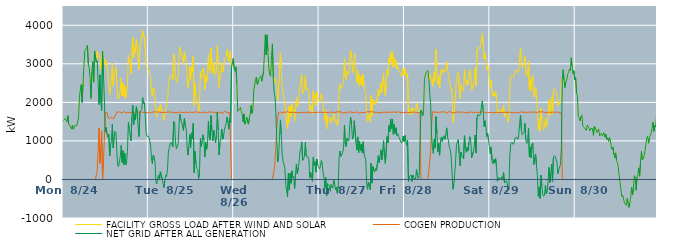
| Category | FACILITY GROSS LOAD AFTER WIND AND SOLAR | COGEN PRODUCTION | NET GRID AFTER ALL GENERATION |
|---|---|---|---|
|  Mon  8/24 | 1529 | 0 | 1529 |
|  Mon  8/24 | 1554 | 0 | 1554 |
|  Mon  8/24 | 1584 | 0 | 1584 |
|  Mon  8/24 | 1543 | 0 | 1543 |
|  Mon  8/24 | 1489 | 0 | 1489 |
|  Mon  8/24 | 1659 | 0 | 1659 |
|  Mon  8/24 | 1444 | 0 | 1444 |
|  Mon  8/24 | 1433 | 0 | 1433 |
|  Mon  8/24 | 1363 | 0 | 1363 |
|  Mon  8/24 | 1308 | 0 | 1308 |
|  Mon  8/24 | 1404 | 0 | 1404 |
|  Mon  8/24 | 1299 | 0 | 1299 |
|  Mon  8/24 | 1345 | 0 | 1345 |
|  Mon  8/24 | 1401 | 0 | 1401 |
|  Mon  8/24 | 1379 | 0 | 1379 |
|  Mon  8/24 | 1394 | 0 | 1394 |
|  Mon  8/24 | 1381 | 0 | 1381 |
|  Mon  8/24 | 1596 | 0 | 1596 |
|  Mon  8/24 | 2138 | 0 | 2138 |
|  Mon  8/24 | 2319 | 0 | 2319 |
|  Mon  8/24 | 2463 | 0 | 2463 |
|  Mon  8/24 | 1998 | 0 | 1998 |
|  Mon  8/24 | 2466 | 0 | 2466 |
|  Mon  8/24 | 2927 | 0 | 2927 |
|  Mon  8/24 | 3332 | 0 | 3332 |
|  Mon  8/24 | 3370 | 0 | 3370 |
|  Mon  8/24 | 3423 | 0 | 3423 |
|  Mon  8/24 | 3482 | 0 | 3482 |
|  Mon  8/24 | 2977 | 0 | 2977 |
|  Mon  8/24 | 2883 | 0 | 2883 |
|  Mon  8/24 | 2602 | 0 | 2602 |
|  Mon  8/24 | 2101 | 0 | 2101 |
|  Mon  8/24 | 2785 | 0 | 2785 |
|  Mon  8/24 | 3054 | 0 | 3054 |
|  Mon  8/24 | 2524 | 0 | 2524 |
|  Mon  8/24 | 3336 | 0 | 3336 |
|  Mon  8/24 | 3355 | 0 | 3355 |
|  Mon  8/24 | 3036 | 0 | 3036 |
|  Mon  8/24 | 3329 | 250 | 3079 |
|  Mon  8/24 | 3273 | 745 | 2528 |
|  Mon  8/24 | 3279 | 1335 | 1944 |
|  Mon  8/24 | 3135 | 419 | 2716 |
|  Mon  8/24 | 2861 | 839 | 2022 |
|  Mon  8/24 | 3051 | 1260 | 1791 |
|  Mon  8/24 | 3333 | 0 | 3333 |
|  Mon  8/24 | 3189 | 492 | 2697 |
|  Mon  8/24 | 3135 | 1018 | 2117 |
|  Mon  8/24 | 2981 | 1740 | 1241 |
|  Mon  8/24 | 3085 | 1733 | 1352 |
|  Mon  8/24 | 2917 | 1737 | 1180 |
|  Mon  8/24 | 2735 | 1641 | 1094 |
|  Mon  8/24 | 2754 | 1580 | 1174 |
|  Mon  8/24 | 2206 | 1595 | 611 |
|  Mon  8/24 | 2457 | 1606 | 851 |
|  Mon  8/24 | 2640 | 1593 | 1047 |
|  Mon  8/24 | 3020 | 1589 | 1431 |
|  Mon  8/24 | 2426 | 1609 | 817 |
|  Mon  8/24 | 2697 | 1593 | 1104 |
|  Mon  8/24 | 2839 | 1588 | 1251 |
|  Mon  8/24 | 2912 | 1688 | 1224 |
|  Mon  8/24 | 2494 | 1746 | 748 |
|  Mon  8/24 | 2114 | 1750 | 364 |
|  Mon  8/24 | 2082 | 1752 | 330 |
|  Mon  8/24 | 2210 | 1750 | 460 |
|  Mon  8/24 | 2361 | 1749 | 612 |
|  Mon  8/24 | 2626 | 1741 | 885 |
|  Mon  8/24 | 2170 | 1729 | 441 |
|  Mon  8/24 | 2493 | 1746 | 747 |
|  Mon  8/24 | 2148 | 1764 | 384 |
|  Mon  8/24 | 2430 | 1751 | 679 |
|  Mon  8/24 | 2108 | 1728 | 380 |
|  Mon  8/24 | 2209 | 1753 | 456 |
|  Mon  8/24 | 2459 | 1729 | 730 |
|  Mon  8/24 | 3231 | 1746 | 1485 |
|  Mon  8/24 | 3044 | 1742 | 1302 |
|  Mon  8/24 | 3078 | 1752 | 1326 |
|  Mon  8/24 | 2735 | 1732 | 1003 |
|  Mon  8/24 | 3339 | 1723 | 1616 |
|  Mon  8/24 | 3689 | 1764 | 1925 |
|  Mon  8/24 | 3151 | 1725 | 1426 |
|  Mon  8/24 | 3428 | 1740 | 1688 |
|  Mon  8/24 | 3286 | 1738 | 1548 |
|  Mon  8/24 | 3625 | 1735 | 1890 |
|  Mon  8/24 | 3506 | 1752 | 1754 |
|  Mon  8/24 | 3101 | 1738 | 1363 |
|  Mon  8/24 | 2858 | 1745 | 1113 |
|  Mon  8/24 | 3479 | 1731 | 1748 |
|  Mon  8/24 | 3540 | 1759 | 1781 |
|  Mon  8/24 | 3556 | 1740 | 1816 |
|  Mon  8/24 | 3867 | 1742 | 2125 |
|  Mon  8/24 | 3685 | 1721 | 1964 |
|  Mon  8/24 | 3741 | 1740 | 2001 |
|  Mon  8/24 | 3382 | 1744 | 1638 |
|  Mon  8/24 | 2960 | 1736 | 1224 |
|  Mon  8/24 | 2868 | 1748 | 1120 |
|  Mon  8/24 | 2867 | 1731 | 1136 |
|  Tue  8/25 | 2855 | 1749 | 1106 |
|  Tue  8/25 | 2747 | 1744 | 1003 |
|  Tue  8/25 | 2625 | 1735 | 890 |
|  Tue  8/25 | 2280 | 1736 | 544 |
|  Tue  8/25 | 2152 | 1744 | 408 |
|  Tue  8/25 | 2379 | 1748 | 631 |
|  Tue  8/25 | 2347 | 1748 | 599 |
|  Tue  8/25 | 2218 | 1760 | 458 |
|  Tue  8/25 | 1668 | 1751 | -83 |
|  Tue  8/25 | 1620 | 1738 | -118 |
|  Tue  8/25 | 1778 | 1745 | 33 |
|  Tue  8/25 | 1874 | 1764 | 110 |
|  Tue  8/25 | 1729 | 1734 | -5 |
|  Tue  8/25 | 1951 | 1752 | 199 |
|  Tue  8/25 | 1926 | 1742 | 184 |
|  Tue  8/25 | 1763 | 1745 | 18 |
|  Tue  8/25 | 1742 | 1736 | 6 |
|  Tue  8/25 | 1529 | 1745 | -216 |
|  Tue  8/25 | 1703 | 1744 | -41 |
|  Tue  8/25 | 1840 | 1727 | 113 |
|  Tue  8/25 | 1825 | 1744 | 81 |
|  Tue  8/25 | 1999 | 1744 | 255 |
|  Tue  8/25 | 2443 | 1747 | 696 |
|  Tue  8/25 | 2570 | 1746 | 824 |
|  Tue  8/25 | 2686 | 1752 | 934 |
|  Tue  8/25 | 2693 | 1733 | 960 |
|  Tue  8/25 | 2684 | 1740 | 944 |
|  Tue  8/25 | 2587 | 1738 | 849 |
|  Tue  8/25 | 3242 | 1740 | 1502 |
|  Tue  8/25 | 3194 | 1733 | 1461 |
|  Tue  8/25 | 2704 | 1732 | 972 |
|  Tue  8/25 | 2515 | 1721 | 794 |
|  Tue  8/25 | 2565 | 1727 | 838 |
|  Tue  8/25 | 2672 | 1740 | 932 |
|  Tue  8/25 | 3148 | 1740 | 1408 |
|  Tue  8/25 | 3437 | 1750 | 1687 |
|  Tue  8/25 | 3295 | 1747 | 1548 |
|  Tue  8/25 | 3202 | 1735 | 1467 |
|  Tue  8/25 | 3224 | 1739 | 1485 |
|  Tue  8/25 | 3012 | 1742 | 1270 |
|  Tue  8/25 | 3317 | 1735 | 1582 |
|  Tue  8/25 | 3149 | 1738 | 1411 |
|  Tue  8/25 | 3074 | 1748 | 1326 |
|  Tue  8/25 | 2620 | 1751 | 869 |
|  Tue  8/25 | 2366 | 1734 | 632 |
|  Tue  8/25 | 2586 | 1748 | 838 |
|  Tue  8/25 | 2922 | 1754 | 1168 |
|  Tue  8/25 | 2573 | 1747 | 826 |
|  Tue  8/25 | 2944 | 1734 | 1210 |
|  Tue  8/25 | 2795 | 1742 | 1053 |
|  Tue  8/25 | 3194 | 1738 | 1456 |
|  Tue  8/25 | 1923 | 1747 | 176 |
|  Tue  8/25 | 2487 | 1756 | 731 |
|  Tue  8/25 | 2154 | 1747 | 407 |
|  Tue  8/25 | 2031 | 1745 | 286 |
|  Tue  8/25 | 1980 | 1723 | 257 |
|  Tue  8/25 | 1769 | 1744 | 25 |
|  Tue  8/25 | 1896 | 1748 | 148 |
|  Tue  8/25 | 2802 | 1735 | 1067 |
|  Tue  8/25 | 2610 | 1753 | 857 |
|  Tue  8/25 | 2745 | 1743 | 1002 |
|  Tue  8/25 | 2888 | 1728 | 1160 |
|  Tue  8/25 | 2767 | 1749 | 1018 |
|  Tue  8/25 | 2325 | 1743 | 582 |
|  Tue  8/25 | 2694 | 1727 | 967 |
|  Tue  8/25 | 2527 | 1747 | 780 |
|  Tue  8/25 | 2668 | 1738 | 930 |
|  Tue  8/25 | 3258 | 1750 | 1508 |
|  Tue  8/25 | 2854 | 1750 | 1104 |
|  Tue  8/25 | 2767 | 1750 | 1017 |
|  Tue  8/25 | 3405 | 1748 | 1657 |
|  Tue  8/25 | 2970 | 1733 | 1237 |
|  Tue  8/25 | 2743 | 1742 | 1001 |
|  Tue  8/25 | 3034 | 1757 | 1277 |
|  Tue  8/25 | 2888 | 1742 | 1146 |
|  Tue  8/25 | 2701 | 1756 | 945 |
|  Tue  8/25 | 2863 | 1725 | 1138 |
|  Tue  8/25 | 3482 | 1746 | 1736 |
|  Tue  8/25 | 3030 | 1744 | 1286 |
|  Tue  8/25 | 2393 | 1759 | 634 |
|  Tue  8/25 | 2694 | 1746 | 948 |
|  Tue  8/25 | 2803 | 1741 | 1062 |
|  Tue  8/25 | 3031 | 1723 | 1308 |
|  Tue  8/25 | 2783 | 1741 | 1042 |
|  Tue  8/25 | 2851 | 1732 | 1119 |
|  Tue  8/25 | 3047 | 1767 | 1280 |
|  Tue  8/25 | 3132 | 1754 | 1378 |
|  Tue  8/25 | 3203 | 1752 | 1451 |
|  Tue  8/25 | 3374 | 1752 | 1622 |
|  Tue  8/25 | 3208 | 1732 | 1476 |
|  Tue  8/25 | 3054 | 1750 | 1304 |
|  Tue  8/25 | 3324 | 1740 | 1584 |
|  Tue  8/25 | 3224 | 1753 | 1471 |
|  Tue  8/25 | 2920 | 0 | 2920 |
|  Tue  8/25 | 2941 | 0 | 2941 |
|  Tue  8/25 | 3138 | 0 | 3138 |
|  Wed  8/26 | 2881 | 0 | 2881 |
|  Wed  8/26 | 2808 | 0 | 2808 |
|  Wed  8/26 | 2918 | 0 | 2918 |
|  Wed  8/26 | 2492 | 0 | 2492 |
|  Wed  8/26 | 1764 | 0 | 1764 |
|  Wed  8/26 | 1764 | 0 | 1764 |
|  Wed  8/26 | 1825 | 0 | 1825 |
|  Wed  8/26 | 1871 | 0 | 1871 |
|  Wed  8/26 | 1766 | 0 | 1766 |
|  Wed  8/26 | 1714 | 0 | 1714 |
|  Wed  8/26 | 1490 | 0 | 1490 |
|  Wed  8/26 | 1700 | 0 | 1700 |
|  Wed  8/26 | 1434 | 0 | 1434 |
|  Wed  8/26 | 1495 | 0 | 1495 |
|  Wed  8/26 | 1620 | 0 | 1620 |
|  Wed  8/26 | 1643 | 0 | 1643 |
|  Wed  8/26 | 1434 | 0 | 1434 |
|  Wed  8/26 | 1581 | 0 | 1581 |
|  Wed  8/26 | 1698 | 0 | 1698 |
|  Wed  8/26 | 1920 | 0 | 1920 |
|  Wed  8/26 | 1714 | 0 | 1714 |
|  Wed  8/26 | 1813 | 0 | 1813 |
|  Wed  8/26 | 2301 | 0 | 2301 |
|  Wed  8/26 | 2323 | 0 | 2323 |
|  Wed  8/26 | 2598 | 0 | 2598 |
|  Wed  8/26 | 2654 | 0 | 2654 |
|  Wed  8/26 | 2465 | 0 | 2465 |
|  Wed  8/26 | 2499 | 0 | 2499 |
|  Wed  8/26 | 2615 | 0 | 2615 |
|  Wed  8/26 | 2650 | 0 | 2650 |
|  Wed  8/26 | 2685 | 0 | 2685 |
|  Wed  8/26 | 2550 | 0 | 2550 |
|  Wed  8/26 | 2539 | 0 | 2539 |
|  Wed  8/26 | 2793 | 0 | 2793 |
|  Wed  8/26 | 2798 | 0 | 2798 |
|  Wed  8/26 | 3757 | 0 | 3757 |
|  Wed  8/26 | 3232 | 0 | 3232 |
|  Wed  8/26 | 3751 | 0 | 3751 |
|  Wed  8/26 | 3328 | 0 | 3328 |
|  Wed  8/26 | 2882 | 0 | 2882 |
|  Wed  8/26 | 2718 | 0 | 2718 |
|  Wed  8/26 | 2677 | 0 | 2677 |
|  Wed  8/26 | 3215 | 0 | 3215 |
|  Wed  8/26 | 3518 | 0 | 3518 |
|  Wed  8/26 | 2647 | 0 | 2647 |
|  Wed  8/26 | 2501 | 261 | 2240 |
|  Wed  8/26 | 2623 | 490 | 2133 |
|  Wed  8/26 | 2571 | 899 | 1672 |
|  Wed  8/26 | 2343 | 1391 | 952 |
|  Wed  8/26 | 2057 | 1602 | 455 |
|  Wed  8/26 | 2349 | 1739 | 610 |
|  Wed  8/26 | 2859 | 1746 | 1113 |
|  Wed  8/26 | 3294 | 1750 | 1544 |
|  Wed  8/26 | 2887 | 1743 | 1144 |
|  Wed  8/26 | 2376 | 1725 | 651 |
|  Wed  8/26 | 2220 | 1749 | 471 |
|  Wed  8/26 | 2130 | 1747 | 383 |
|  Wed  8/26 | 2030 | 1739 | 291 |
|  Wed  8/26 | 1605 | 1740 | -135 |
|  Wed  8/26 | 1584 | 1737 | -153 |
|  Wed  8/26 | 1318 | 1764 | -446 |
|  Wed  8/26 | 1910 | 1748 | 162 |
|  Wed  8/26 | 1465 | 1737 | -272 |
|  Wed  8/26 | 1900 | 1737 | 163 |
|  Wed  8/26 | 1641 | 1741 | -100 |
|  Wed  8/26 | 1962 | 1739 | 223 |
|  Wed  8/26 | 1780 | 1741 | 39 |
|  Wed  8/26 | 1823 | 1748 | 75 |
|  Wed  8/26 | 1510 | 1741 | -231 |
|  Wed  8/26 | 1908 | 1750 | 158 |
|  Wed  8/26 | 2130 | 1736 | 394 |
|  Wed  8/26 | 1877 | 1733 | 144 |
|  Wed  8/26 | 2044 | 1742 | 302 |
|  Wed  8/26 | 2164 | 1731 | 433 |
|  Wed  8/26 | 2453 | 1737 | 716 |
|  Wed  8/26 | 2553 | 1745 | 808 |
|  Wed  8/26 | 2717 | 1743 | 974 |
|  Wed  8/26 | 2225 | 1729 | 496 |
|  Wed  8/26 | 2260 | 1729 | 531 |
|  Wed  8/26 | 2355 | 1749 | 606 |
|  Wed  8/26 | 2698 | 1739 | 959 |
|  Wed  8/26 | 2342 | 1737 | 605 |
|  Wed  8/26 | 2374 | 1746 | 628 |
|  Wed  8/26 | 2331 | 1742 | 589 |
|  Wed  8/26 | 2268 | 1743 | 525 |
|  Wed  8/26 | 1787 | 1746 | 41 |
|  Wed  8/26 | 1926 | 1734 | 192 |
|  Wed  8/26 | 1807 | 1750 | 57 |
|  Wed  8/26 | 1686 | 1732 | -46 |
|  Wed  8/26 | 2321 | 1743 | 578 |
|  Wed  8/26 | 2110 | 1742 | 368 |
|  Wed  8/26 | 2197 | 1737 | 460 |
|  Wed  8/26 | 1925 | 1734 | 191 |
|  Wed  8/26 | 2273 | 1744 | 529 |
|  Wed  8/26 | 2124 | 1746 | 378 |
|  Wed  8/26 | 2060 | 1728 | 332 |
|  Thu  8/27 | 2011 | 1742 | 269 |
|  Thu  8/27 | 2078 | 1743 | 335 |
|  Thu  8/27 | 2233 | 1743 | 490 |
|  Thu  8/27 | 2136 | 1742 | 394 |
|  Thu  8/27 | 1910 | 1734 | 176 |
|  Thu  8/27 | 1771 | 1731 | 40 |
|  Thu  8/27 | 1526 | 1746 | -220 |
|  Thu  8/27 | 1801 | 1752 | 49 |
|  Thu  8/27 | 1309 | 1740 | -431 |
|  Thu  8/27 | 1640 | 1750 | -110 |
|  Thu  8/27 | 1603 | 1734 | -131 |
|  Thu  8/27 | 1573 | 1743 | -170 |
|  Thu  8/27 | 1444 | 1748 | -304 |
|  Thu  8/27 | 1608 | 1739 | -131 |
|  Thu  8/27 | 1598 | 1745 | -147 |
|  Thu  8/27 | 1514 | 1738 | -224 |
|  Thu  8/27 | 1716 | 1738 | -22 |
|  Thu  8/27 | 1619 | 1736 | -117 |
|  Thu  8/27 | 1471 | 1740 | -269 |
|  Thu  8/27 | 1520 | 1725 | -205 |
|  Thu  8/27 | 1397 | 1756 | -359 |
|  Thu  8/27 | 1567 | 1737 | -170 |
|  Thu  8/27 | 2313 | 1754 | 559 |
|  Thu  8/27 | 2478 | 1744 | 734 |
|  Thu  8/27 | 2349 | 1751 | 598 |
|  Thu  8/27 | 2382 | 1748 | 634 |
|  Thu  8/27 | 2438 | 1731 | 707 |
|  Thu  8/27 | 2575 | 1754 | 821 |
|  Thu  8/27 | 3140 | 1727 | 1413 |
|  Thu  8/27 | 2651 | 1741 | 910 |
|  Thu  8/27 | 2590 | 1744 | 846 |
|  Thu  8/27 | 2813 | 1737 | 1076 |
|  Thu  8/27 | 2775 | 1742 | 1033 |
|  Thu  8/27 | 2735 | 1740 | 995 |
|  Thu  8/27 | 3150 | 1752 | 1398 |
|  Thu  8/27 | 3355 | 1748 | 1607 |
|  Thu  8/27 | 3165 | 1743 | 1422 |
|  Thu  8/27 | 2775 | 1728 | 1047 |
|  Thu  8/27 | 2853 | 1738 | 1115 |
|  Thu  8/27 | 3272 | 1748 | 1524 |
|  Thu  8/27 | 3233 | 1732 | 1501 |
|  Thu  8/27 | 2696 | 1746 | 950 |
|  Thu  8/27 | 2516 | 1757 | 759 |
|  Thu  8/27 | 2838 | 1734 | 1104 |
|  Thu  8/27 | 2414 | 1721 | 693 |
|  Thu  8/27 | 2721 | 1735 | 986 |
|  Thu  8/27 | 2490 | 1735 | 755 |
|  Thu  8/27 | 2667 | 1752 | 915 |
|  Thu  8/27 | 2434 | 1738 | 696 |
|  Thu  8/27 | 2733 | 1754 | 979 |
|  Thu  8/27 | 2404 | 1735 | 669 |
|  Thu  8/27 | 2318 | 1744 | 574 |
|  Thu  8/27 | 2246 | 1739 | 507 |
|  Thu  8/27 | 1640 | 1728 | -88 |
|  Thu  8/27 | 1509 | 1764 | -255 |
|  Thu  8/27 | 1686 | 1753 | -67 |
|  Thu  8/27 | 1617 | 1751 | -134 |
|  Thu  8/27 | 1484 | 1754 | -270 |
|  Thu  8/27 | 2183 | 1759 | 424 |
|  Thu  8/27 | 1644 | 1739 | -95 |
|  Thu  8/27 | 2081 | 1748 | 333 |
|  Thu  8/27 | 2090 | 1736 | 354 |
|  Thu  8/27 | 1942 | 1745 | 197 |
|  Thu  8/27 | 2041 | 1750 | 291 |
|  Thu  8/27 | 1978 | 1745 | 233 |
|  Thu  8/27 | 2149 | 1743 | 406 |
|  Thu  8/27 | 2345 | 1729 | 616 |
|  Thu  8/27 | 2164 | 1729 | 435 |
|  Thu  8/27 | 2311 | 1731 | 580 |
|  Thu  8/27 | 2514 | 1745 | 769 |
|  Thu  8/27 | 2247 | 1740 | 507 |
|  Thu  8/27 | 2493 | 1736 | 757 |
|  Thu  8/27 | 2748 | 1742 | 1006 |
|  Thu  8/27 | 2339 | 1742 | 597 |
|  Thu  8/27 | 2158 | 1746 | 412 |
|  Thu  8/27 | 2134 | 1736 | 398 |
|  Thu  8/27 | 2849 | 1737 | 1112 |
|  Thu  8/27 | 2707 | 1754 | 953 |
|  Thu  8/27 | 3144 | 1746 | 1398 |
|  Thu  8/27 | 2985 | 1740 | 1245 |
|  Thu  8/27 | 3316 | 1744 | 1572 |
|  Thu  8/27 | 3058 | 1745 | 1313 |
|  Thu  8/27 | 3310 | 1747 | 1563 |
|  Thu  8/27 | 2906 | 1738 | 1168 |
|  Thu  8/27 | 3172 | 1750 | 1422 |
|  Thu  8/27 | 2937 | 1743 | 1194 |
|  Thu  8/27 | 3079 | 1738 | 1341 |
|  Thu  8/27 | 2880 | 1742 | 1138 |
|  Thu  8/27 | 2945 | 1757 | 1188 |
|  Thu  8/27 | 2846 | 1737 | 1109 |
|  Thu  8/27 | 2804 | 1744 | 1060 |
|  Thu  8/27 | 2810 | 1735 | 1075 |
|  Thu  8/27 | 2675 | 1731 | 944 |
|  Thu  8/27 | 2708 | 1731 | 977 |
|  Thu  8/27 | 2877 | 1752 | 1125 |
|  Thu  8/27 | 2709 | 1723 | 986 |
|  Fri  8/28 | 2886 | 1745 | 1141 |
|  Fri  8/28 | 2738 | 1746 | 992 |
|  Fri  8/28 | 2633 | 1746 | 887 |
|  Fri  8/28 | 2745 | 1732 | 1013 |
|  Fri  8/28 | 1693 | 1745 | -52 |
|  Fri  8/28 | 1811 | 1739 | 72 |
|  Fri  8/28 | 1802 | 1739 | 63 |
|  Fri  8/28 | 1862 | 1742 | 120 |
|  Fri  8/28 | 1672 | 1724 | -52 |
|  Fri  8/28 | 1854 | 1743 | 111 |
|  Fri  8/28 | 1800 | 1749 | 51 |
|  Fri  8/28 | 1825 | 1753 | 72 |
|  Fri  8/28 | 1729 | 1742 | -13 |
|  Fri  8/28 | 1986 | 1733 | 253 |
|  Fri  8/28 | 1855 | 1741 | 114 |
|  Fri  8/28 | 1762 | 1737 | 25 |
|  Fri  8/28 | 1816 | 1719 | 97 |
|  Fri  8/28 | 1835 | 1738 | 97 |
|  Fri  8/28 | 1802 | 0 | 1802 |
|  Fri  8/28 | 1780 | 0 | 1780 |
|  Fri  8/28 | 1658 | 0 | 1658 |
|  Fri  8/28 | 1775 | 0 | 1775 |
|  Fri  8/28 | 2626 | 0 | 2626 |
|  Fri  8/28 | 2651 | 0 | 2651 |
|  Fri  8/28 | 2783 | 0 | 2783 |
|  Fri  8/28 | 2782 | 0 | 2782 |
|  Fri  8/28 | 2821 | 0 | 2821 |
|  Fri  8/28 | 2582 | 0 | 2582 |
|  Fri  8/28 | 2723 | 497 | 2226 |
|  Fri  8/28 | 2659 | 748 | 1911 |
|  Fri  8/28 | 2508 | 1393 | 1115 |
|  Fri  8/28 | 2589 | 1762 | 827 |
|  Fri  8/28 | 2420 | 1743 | 677 |
|  Fri  8/28 | 2783 | 1743 | 1040 |
|  Fri  8/28 | 2554 | 1740 | 814 |
|  Fri  8/28 | 3374 | 1746 | 1628 |
|  Fri  8/28 | 2936 | 1743 | 1193 |
|  Fri  8/28 | 2455 | 1741 | 714 |
|  Fri  8/28 | 2690 | 1753 | 937 |
|  Fri  8/28 | 2371 | 1742 | 629 |
|  Fri  8/28 | 2760 | 1759 | 1001 |
|  Fri  8/28 | 2851 | 1750 | 1101 |
|  Fri  8/28 | 2745 | 1757 | 988 |
|  Fri  8/28 | 2859 | 1757 | 1102 |
|  Fri  8/28 | 2873 | 1739 | 1134 |
|  Fri  8/28 | 2788 | 1747 | 1041 |
|  Fri  8/28 | 2895 | 1740 | 1155 |
|  Fri  8/28 | 3057 | 1718 | 1339 |
|  Fri  8/28 | 2828 | 1726 | 1102 |
|  Fri  8/28 | 2745 | 1751 | 994 |
|  Fri  8/28 | 2555 | 1728 | 827 |
|  Fri  8/28 | 2547 | 1762 | 785 |
|  Fri  8/28 | 2315 | 1727 | 588 |
|  Fri  8/28 | 2356 | 1752 | 604 |
|  Fri  8/28 | 1477 | 1730 | -253 |
|  Fri  8/28 | 1623 | 1750 | -127 |
|  Fri  8/28 | 1881 | 1732 | 149 |
|  Fri  8/28 | 2211 | 1739 | 472 |
|  Fri  8/28 | 2649 | 1748 | 901 |
|  Fri  8/28 | 2662 | 1745 | 917 |
|  Fri  8/28 | 2781 | 1751 | 1030 |
|  Fri  8/28 | 2434 | 1744 | 690 |
|  Fri  8/28 | 2099 | 1747 | 352 |
|  Fri  8/28 | 2448 | 1737 | 711 |
|  Fri  8/28 | 2354 | 1738 | 616 |
|  Fri  8/28 | 2324 | 1738 | 586 |
|  Fri  8/28 | 2288 | 1753 | 535 |
|  Fri  8/28 | 2861 | 1727 | 1134 |
|  Fri  8/28 | 2595 | 1747 | 848 |
|  Fri  8/28 | 2445 | 1741 | 704 |
|  Fri  8/28 | 2571 | 1739 | 832 |
|  Fri  8/28 | 2463 | 1727 | 736 |
|  Fri  8/28 | 2708 | 1743 | 965 |
|  Fri  8/28 | 2852 | 1745 | 1107 |
|  Fri  8/28 | 2763 | 1745 | 1018 |
|  Fri  8/28 | 2313 | 1750 | 563 |
|  Fri  8/28 | 2298 | 1740 | 558 |
|  Fri  8/28 | 2449 | 1730 | 719 |
|  Fri  8/28 | 2605 | 1747 | 858 |
|  Fri  8/28 | 2898 | 1746 | 1152 |
|  Fri  8/28 | 2434 | 1749 | 685 |
|  Fri  8/28 | 3340 | 1741 | 1599 |
|  Fri  8/28 | 3429 | 1743 | 1686 |
|  Fri  8/28 | 3416 | 1734 | 1682 |
|  Fri  8/28 | 3392 | 1744 | 1648 |
|  Fri  8/28 | 3454 | 1746 | 1708 |
|  Fri  8/28 | 3461 | 1737 | 1724 |
|  Fri  8/28 | 3792 | 1757 | 2035 |
|  Fri  8/28 | 3538 | 1741 | 1797 |
|  Fri  8/28 | 3124 | 1750 | 1374 |
|  Fri  8/28 | 3280 | 1756 | 1524 |
|  Fri  8/28 | 3102 | 1727 | 1375 |
|  Fri  8/28 | 2855 | 1738 | 1117 |
|  Fri  8/28 | 2940 | 1739 | 1201 |
|  Fri  8/28 | 2784 | 1756 | 1028 |
|  Fri  8/28 | 2591 | 1736 | 855 |
|  Sat  8/29 | 2408 | 1744 | 664 |
|  Sat  8/29 | 2570 | 1736 | 834 |
|  Sat  8/29 | 2230 | 1737 | 493 |
|  Sat  8/29 | 2148 | 1736 | 412 |
|  Sat  8/29 | 2249 | 1732 | 517 |
|  Sat  8/29 | 2174 | 1736 | 438 |
|  Sat  8/29 | 2281 | 1739 | 542 |
|  Sat  8/29 | 2073 | 1740 | 333 |
|  Sat  8/29 | 1708 | 1756 | -48 |
|  Sat  8/29 | 1707 | 1735 | -28 |
|  Sat  8/29 | 1807 | 1754 | 53 |
|  Sat  8/29 | 1811 | 1736 | 75 |
|  Sat  8/29 | 1750 | 1758 | -8 |
|  Sat  8/29 | 1812 | 1741 | 71 |
|  Sat  8/29 | 1735 | 1750 | -15 |
|  Sat  8/29 | 1920 | 1739 | 181 |
|  Sat  8/29 | 1630 | 1720 | -90 |
|  Sat  8/29 | 1632 | 1745 | -113 |
|  Sat  8/29 | 1703 | 1737 | -34 |
|  Sat  8/29 | 1653 | 1736 | -83 |
|  Sat  8/29 | 1480 | 1743 | -263 |
|  Sat  8/29 | 1570 | 1749 | -179 |
|  Sat  8/29 | 2379 | 1748 | 631 |
|  Sat  8/29 | 2662 | 1736 | 926 |
|  Sat  8/29 | 2710 | 1738 | 972 |
|  Sat  8/29 | 2716 | 1727 | 989 |
|  Sat  8/29 | 2650 | 1742 | 908 |
|  Sat  8/29 | 2706 | 1735 | 971 |
|  Sat  8/29 | 2824 | 1744 | 1080 |
|  Sat  8/29 | 2802 | 1743 | 1059 |
|  Sat  8/29 | 2831 | 1742 | 1089 |
|  Sat  8/29 | 2775 | 1736 | 1039 |
|  Sat  8/29 | 2881 | 1732 | 1149 |
|  Sat  8/29 | 3171 | 1735 | 1436 |
|  Sat  8/29 | 3409 | 1737 | 1672 |
|  Sat  8/29 | 3045 | 1756 | 1289 |
|  Sat  8/29 | 2907 | 1741 | 1166 |
|  Sat  8/29 | 2899 | 1741 | 1158 |
|  Sat  8/29 | 2956 | 1741 | 1215 |
|  Sat  8/29 | 3199 | 1745 | 1454 |
|  Sat  8/29 | 2768 | 1739 | 1029 |
|  Sat  8/29 | 2672 | 1739 | 933 |
|  Sat  8/29 | 2730 | 1741 | 989 |
|  Sat  8/29 | 3080 | 1748 | 1332 |
|  Sat  8/29 | 2326 | 1743 | 583 |
|  Sat  8/29 | 2594 | 1750 | 844 |
|  Sat  8/29 | 2292 | 1734 | 558 |
|  Sat  8/29 | 2657 | 1737 | 920 |
|  Sat  8/29 | 2697 | 1750 | 947 |
|  Sat  8/29 | 2139 | 1750 | 389 |
|  Sat  8/29 | 2308 | 1743 | 565 |
|  Sat  8/29 | 2401 | 1741 | 660 |
|  Sat  8/29 | 2097 | 1745 | 352 |
|  Sat  8/29 | 1847 | 1739 | 108 |
|  Sat  8/29 | 1303 | 1739 | -436 |
|  Sat  8/29 | 1569 | 1761 | -192 |
|  Sat  8/29 | 1263 | 1754 | -491 |
|  Sat  8/29 | 1856 | 1744 | 112 |
|  Sat  8/29 | 1568 | 1742 | -174 |
|  Sat  8/29 | 1374 | 1768 | -394 |
|  Sat  8/29 | 1294 | 1732 | -438 |
|  Sat  8/29 | 1330 | 1734 | -404 |
|  Sat  8/29 | 1579 | 1730 | -151 |
|  Sat  8/29 | 1369 | 1744 | -375 |
|  Sat  8/29 | 1440 | 1740 | -300 |
|  Sat  8/29 | 1692 | 1747 | -55 |
|  Sat  8/29 | 2060 | 1748 | 312 |
|  Sat  8/29 | 1659 | 1737 | -78 |
|  Sat  8/29 | 1886 | 1738 | 148 |
|  Sat  8/29 | 2138 | 1745 | 393 |
|  Sat  8/29 | 1695 | 1748 | -53 |
|  Sat  8/29 | 2295 | 1740 | 555 |
|  Sat  8/29 | 2355 | 1740 | 615 |
|  Sat  8/29 | 2328 | 1742 | 586 |
|  Sat  8/29 | 2281 | 1751 | 530 |
|  Sat  8/29 | 2194 | 1747 | 447 |
|  Sat  8/29 | 1898 | 1745 | 153 |
|  Sat  8/29 | 1992 | 1750 | 242 |
|  Sat  8/29 | 1956 | 1731 | 225 |
|  Sat  8/29 | 2135 | 1743 | 392 |
|  Sat  8/29 | 2574 | 1728 | 846 |
|  Sat  8/29 | 2619 | 0 | 2619 |
|  Sat  8/29 | 2847 | 0 | 2847 |
|  Sat  8/29 | 2565 | 0 | 2565 |
|  Sat  8/29 | 2383 | 0 | 2383 |
|  Sat  8/29 | 2531 | 0 | 2531 |
|  Sat  8/29 | 2585 | 0 | 2585 |
|  Sat  8/29 | 2728 | 0 | 2728 |
|  Sat  8/29 | 2766 | 0 | 2766 |
|  Sat  8/29 | 2859 | 0 | 2859 |
|  Sat  8/29 | 2819 | 0 | 2819 |
|  Sat  8/29 | 3156 | 0 | 3156 |
|  Sat  8/29 | 2940 | 0 | 2940 |
|  Sat  8/29 | 2748 | 0 | 2748 |
|  Sat  8/29 | 2821 | 0 | 2821 |
|  Sat  8/29 | 2586 | 0 | 2586 |
|  Sun  8/30 | 2652 | 0 | 2652 |
|  Sun  8/30 | 2237 | 0 | 2237 |
|  Sun  8/30 | 2166 | 0 | 2166 |
|  Sun  8/30 | 1638 | 0 | 1638 |
|  Sun  8/30 | 1602 | 0 | 1602 |
|  Sun  8/30 | 1523 | 0 | 1523 |
|  Sun  8/30 | 1630 | 0 | 1630 |
|  Sun  8/30 | 1675 | 0 | 1675 |
|  Sun  8/30 | 1386 | 0 | 1386 |
|  Sun  8/30 | 1401 | 0 | 1401 |
|  Sun  8/30 | 1342 | 0 | 1342 |
|  Sun  8/30 | 1333 | 0 | 1333 |
|  Sun  8/30 | 1273 | 0 | 1273 |
|  Sun  8/30 | 1413 | 0 | 1413 |
|  Sun  8/30 | 1390 | 0 | 1390 |
|  Sun  8/30 | 1328 | 0 | 1328 |
|  Sun  8/30 | 1260 | 0 | 1260 |
|  Sun  8/30 | 1320 | 0 | 1320 |
|  Sun  8/30 | 1316 | 0 | 1316 |
|  Sun  8/30 | 1321 | 0 | 1321 |
|  Sun  8/30 | 1144 | 0 | 1144 |
|  Sun  8/30 | 1378 | 0 | 1378 |
|  Sun  8/30 | 1348 | 0 | 1348 |
|  Sun  8/30 | 1328 | 0 | 1328 |
|  Sun  8/30 | 1221 | 0 | 1221 |
|  Sun  8/30 | 1239 | 0 | 1239 |
|  Sun  8/30 | 1305 | 0 | 1305 |
|  Sun  8/30 | 1128 | 0 | 1128 |
|  Sun  8/30 | 1158 | 0 | 1158 |
|  Sun  8/30 | 1199 | 0 | 1199 |
|  Sun  8/30 | 1131 | 0 | 1131 |
|  Sun  8/30 | 1132 | 0 | 1132 |
|  Sun  8/30 | 1213 | 0 | 1213 |
|  Sun  8/30 | 1097 | 0 | 1097 |
|  Sun  8/30 | 1171 | 0 | 1171 |
|  Sun  8/30 | 1034 | 0 | 1034 |
|  Sun  8/30 | 1084 | 0 | 1084 |
|  Sun  8/30 | 989 | 0 | 989 |
|  Sun  8/30 | 1086 | 0 | 1086 |
|  Sun  8/30 | 1040 | 0 | 1040 |
|  Sun  8/30 | 859 | 0 | 859 |
|  Sun  8/30 | 775 | 0 | 775 |
|  Sun  8/30 | 841 | 0 | 841 |
|  Sun  8/30 | 648 | 0 | 648 |
|  Sun  8/30 | 559 | 0 | 559 |
|  Sun  8/30 | 690 | 0 | 690 |
|  Sun  8/30 | 496 | 0 | 496 |
|  Sun  8/30 | 443 | 0 | 443 |
|  Sun  8/30 | 298 | 0 | 298 |
|  Sun  8/30 | 93 | 0 | 93 |
|  Sun  8/30 | -96 | 0 | -96 |
|  Sun  8/30 | -88 | 0 | -88 |
|  Sun  8/30 | -444 | 0 | -444 |
|  Sun  8/30 | -407 | 0 | -407 |
|  Sun  8/30 | -427 | 0 | -427 |
|  Sun  8/30 | -618 | 0 | -618 |
|  Sun  8/30 | -604 | 0 | -604 |
|  Sun  8/30 | -672 | 0 | -672 |
|  Sun  8/30 | -490 | 0 | -490 |
|  Sun  8/30 | -623 | 0 | -623 |
|  Sun  8/30 | -726 | 0 | -726 |
|  Sun  8/30 | -604 | 0 | -604 |
|  Sun  8/30 | -440 | 0 | -440 |
|  Sun  8/30 | -204 | 0 | -204 |
|  Sun  8/30 | -405 | 0 | -405 |
|  Sun  8/30 | -249 | 0 | -249 |
|  Sun  8/30 | 98 | 0 | 98 |
|  Sun  8/30 | 33 | 0 | 33 |
|  Sun  8/30 | -280 | 0 | -280 |
|  Sun  8/30 | 56 | 0 | 56 |
|  Sun  8/30 | 121 | 0 | 121 |
|  Sun  8/30 | 301 | 0 | 301 |
|  Sun  8/30 | 84 | 0 | 84 |
|  Sun  8/30 | 467 | 0 | 467 |
|  Sun  8/30 | 729 | 0 | 729 |
|  Sun  8/30 | 504 | 0 | 504 |
|  Sun  8/30 | 536 | 0 | 536 |
|  Sun  8/30 | 612 | 0 | 612 |
|  Sun  8/30 | 738 | 0 | 738 |
|  Sun  8/30 | 759 | 0 | 759 |
|  Sun  8/30 | 1080 | 0 | 1080 |
|  Sun  8/30 | 1123 | 0 | 1123 |
|  Sun  8/30 | 940 | 0 | 940 |
|  Sun  8/30 | 1078 | 0 | 1078 |
|  Sun  8/30 | 1092 | 0 | 1092 |
|  Sun  8/30 | 1209 | 0 | 1209 |
|  Sun  8/30 | 1218 | 0 | 1218 |
|  Sun  8/30 | 1486 | 0 | 1486 |
|  Sun  8/30 | 1248 | 0 | 1248 |
|  Sun  8/30 | 1401 | 0 | 1401 |
|  Sun  8/30 | 1357 | 0 | 1357 |
|  Sun  8/30 | 1679 | 0 | 1679 |